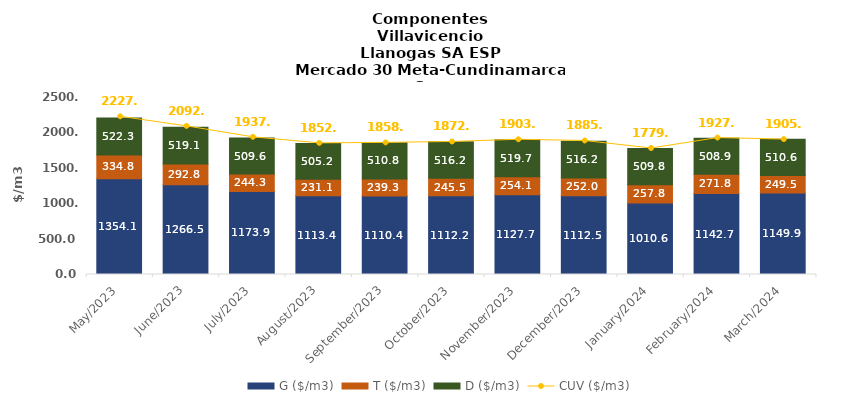
| Category | G ($/m3) | T ($/m3) | D ($/m3) |
|---|---|---|---|
| 2023-05-01 | 1354.14 | 334.83 | 522.32 |
| 2023-06-01 | 1266.52 | 292.77 | 519.06 |
| 2023-07-01 | 1173.91 | 244.29 | 509.62 |
| 2023-08-01 | 1113.38 | 231.11 | 505.17 |
| 2023-09-01 | 1110.42 | 239.27 | 510.83 |
| 2023-10-01 | 1112.24 | 245.53 | 516.22 |
| 2023-11-01 | 1127.7 | 254.12 | 519.71 |
| 2023-12-01 | 1112.49 | 252.02 | 516.22 |
| 2024-01-01 | 1010.63 | 257.82 | 509.77 |
| 2024-02-01 | 1142.71 | 271.82 | 508.9 |
| 2024-03-01 | 1149.94 | 249.54 | 510.61 |